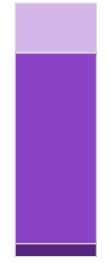
| Category | Series 0 | Series 1 | Series 2 | Series 3 |
|---|---|---|---|---|
| 0 | 5.146 | 74.988 | 0.375 | 19.492 |